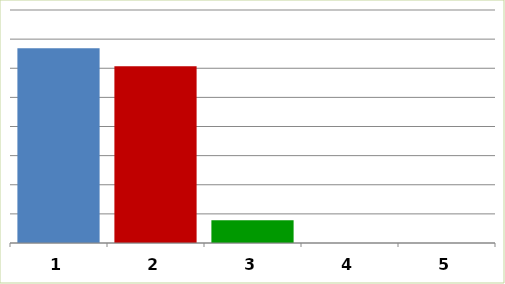
| Category | Series 0 |
|---|---|
| 0 | 33418639 |
| 1 | 30337946 |
| 2 | 3912118 |
| 3 | 0 |
| 4 | 0 |